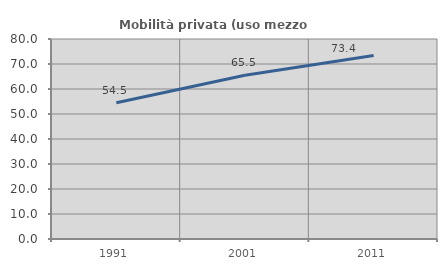
| Category | Mobilità privata (uso mezzo privato) |
|---|---|
| 1991.0 | 54.494 |
| 2001.0 | 65.479 |
| 2011.0 | 73.439 |